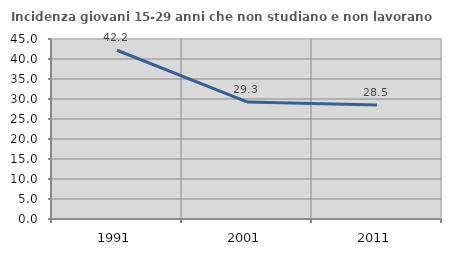
| Category | Incidenza giovani 15-29 anni che non studiano e non lavorano  |
|---|---|
| 1991.0 | 42.188 |
| 2001.0 | 29.274 |
| 2011.0 | 28.481 |